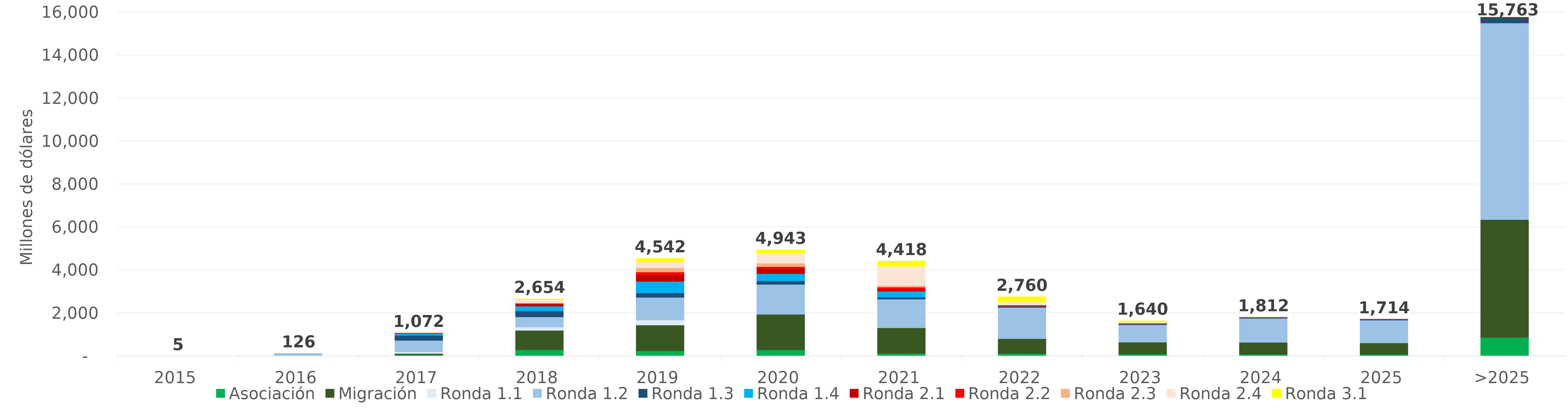
| Category | Asociación | Migración | Ronda 1.1 | Ronda 1.2 | Ronda 1.3 | Ronda 1.4 | Ronda 2.1 | Ronda 2.2 | Ronda 2.3 | Ronda 2.4 | Ronda 3.1 |
|---|---|---|---|---|---|---|---|---|---|---|---|
| 2015 | 0 | 0 | 4.573 | 0.236 | 0 | 0 | 0 | 0 | 0 | 0 | 0 |
| 2016 | 0 | 0 | 16.79 | 108.909 | 0 | 0 | 0 | 0 | 0 | 0 | 0 |
| 2017 | 50.877 | 65.422 | 76.429 | 533.486 | 231.789 | 93.443 | 18.851 | 1.29 | 0.72 | 0 | 0 |
| 2018 | 289.394 | 902.921 | 155.042 | 470.128 | 278.302 | 226.903 | 104.896 | 21.902 | 26.974 | 139.641 | 37.691 |
| 2019 | 241.207 | 1195.818 | 236.68 | 1049.68 | 207.126 | 540.649 | 302.09 | 133.009 | 199.161 | 270.262 | 166.186 |
| 2020 | 284.321 | 1655.641 | 6.736 | 1382.287 | 161.213 | 341.057 | 252.645 | 70.216 | 163.112 | 477.469 | 148.013 |
| 2021 | 118.804 | 1192.243 | 2.229 | 1327.977 | 92.463 | 274.593 | 98.126 | 94.017 | 75.914 | 902.96 | 238.674 |
| 2022 | 112.591 | 689.457 | 0 | 1456.781 | 44.141 | 10.69 | 22.683 | 31.916 | 2.635 | 142.246 | 247.297 |
| 2023 | 87.085 | 555.219 | 0 | 811.608 | 38.135 | 0.73 | 0.019 | 37.005 | 0.827 | 47.441 | 62.088 |
| 2024 | 79.455 | 553.791 | 0 | 1115.867 | 33.996 | 0 | 0 | 27.408 | 0 | 1.529 | 0 |
| 2025 | 75.288 | 530.69 | 0 | 1062.934 | 35.345 | 0 | 0 | 10.138 | 0 | 0 | 0 |
| >2025 | 859.226 | 5485.433 | 0 | 9144.06 | 249.076 | 0 | 0 | 24.866 | 0 | 0 | 0 |